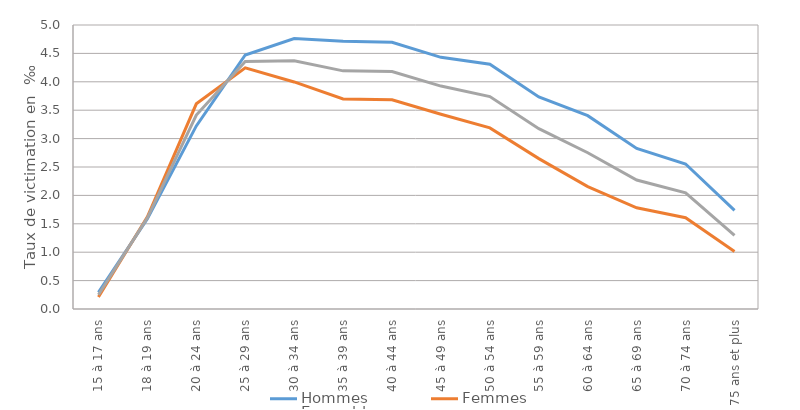
| Category | Hommes | Femmes | Ensemble |
|---|---|---|---|
| 15 à 17 ans | 0.292 | 0.21 | 0.252 |
| 18 à 19 ans | 1.589 | 1.623 | 1.605 |
| 20 à 24 ans | 3.223 | 3.612 | 3.414 |
| 25 à 29 ans | 4.472 | 4.246 | 4.358 |
| 30 à 34 ans | 4.76 | 3.997 | 4.369 |
| 35 à 39 ans | 4.716 | 3.698 | 4.193 |
| 40 à 44 ans | 4.696 | 3.684 | 4.18 |
| 45 à 49 ans | 4.431 | 3.429 | 3.925 |
| 50 à 54 ans | 4.309 | 3.189 | 3.74 |
| 55 à 59 ans | 3.733 | 2.647 | 3.175 |
| 60 à 64 ans | 3.404 | 2.154 | 2.751 |
| 65 à 69 ans | 2.828 | 1.781 | 2.271 |
| 70 à 74 ans | 2.552 | 1.607 | 2.045 |
| 75 ans et plus | 1.737 | 1.011 | 1.295 |